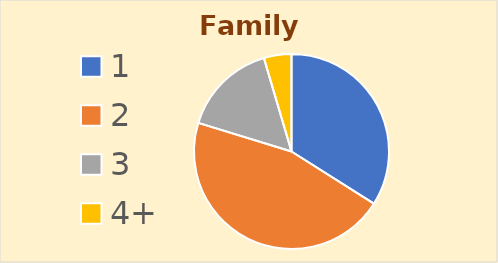
| Category | Series 0 |
|---|---|
| 1 | 52 |
| 2 | 70 |
| 3 | 24 |
| 4+ | 7 |